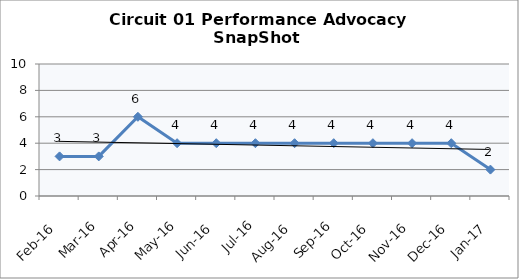
| Category | Circuit 01 |
|---|---|
| Feb-16 | 3 |
| Mar-16 | 3 |
| Apr-16 | 6 |
| May-16 | 4 |
| Jun-16 | 4 |
| Jul-16 | 4 |
| Aug-16 | 4 |
| Sep-16 | 4 |
| Oct-16 | 4 |
| Nov-16 | 4 |
| Dec-16 | 4 |
| Jan-17 | 2 |